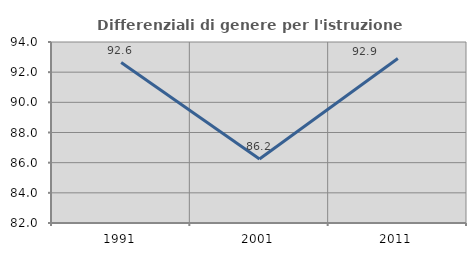
| Category | Differenziali di genere per l'istruzione superiore |
|---|---|
| 1991.0 | 92.634 |
| 2001.0 | 86.24 |
| 2011.0 | 92.901 |